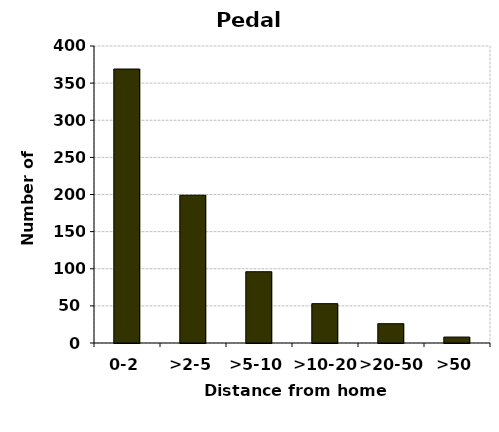
| Category | Pedal cycles |
|---|---|
| 0-2 | 369 |
| >2-5 | 199 |
| >5-10 | 96 |
| >10-20 | 53 |
| >20-50 | 26 |
| >50 | 8 |